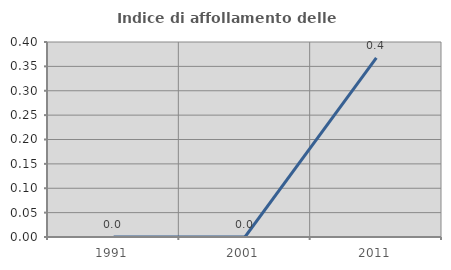
| Category | Indice di affollamento delle abitazioni  |
|---|---|
| 1991.0 | 0 |
| 2001.0 | 0 |
| 2011.0 | 0.368 |